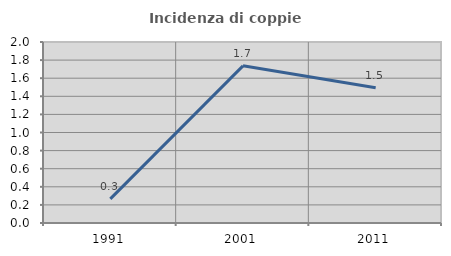
| Category | Incidenza di coppie miste |
|---|---|
| 1991.0 | 0.267 |
| 2001.0 | 1.737 |
| 2011.0 | 1.495 |